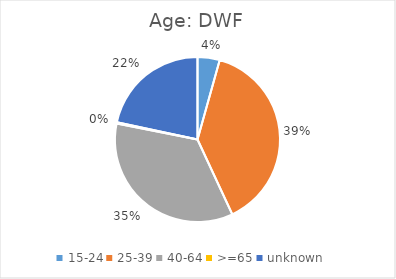
| Category | Age |
|---|---|
| 15-24 | 0.043 |
| 25-39 | 0.387 |
| 40-64 | 0.35 |
| >=65 | 0.003 |
| unknown | 0.216 |